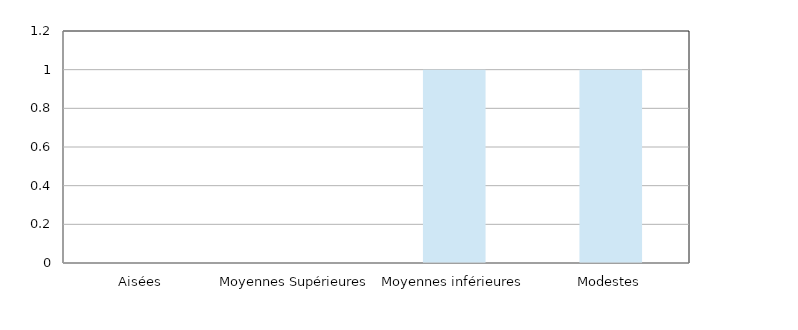
| Category | Series 0 |
|---|---|
| Aisées | 0 |
| Moyennes Supérieures | 0 |
| Moyennes inférieures | 1 |
| Modestes | 1 |